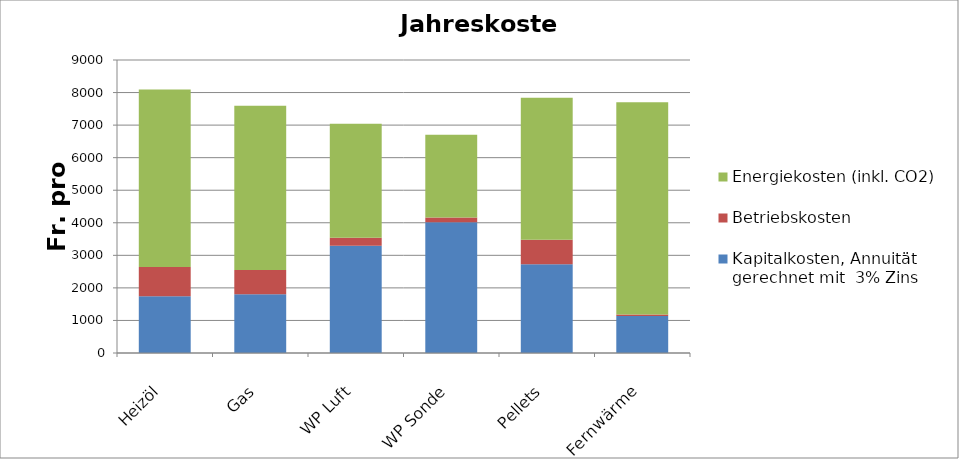
| Category | Kapitalkosten, Annuität gerechnet mit  3% Zins | Betriebskosten | Energiekosten (inkl. CO2) |
|---|---|---|---|
| Heizöl | 1744.68 | 900 | 5450 |
| Gas | 1800.96 | 750 | 5040 |
| WP Luft | 3292.38 | 250 | 3501.538 |
| WP Sonde | 4014.108 | 150 | 2540 |
| Pellets | 2729.58 | 750 | 4360 |
| Fernwärme | 1135.26 | 50 | 6520 |